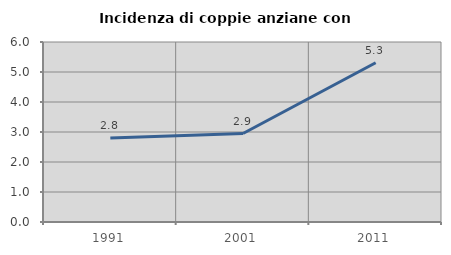
| Category | Incidenza di coppie anziane con figli |
|---|---|
| 1991.0 | 2.804 |
| 2001.0 | 2.948 |
| 2011.0 | 5.31 |